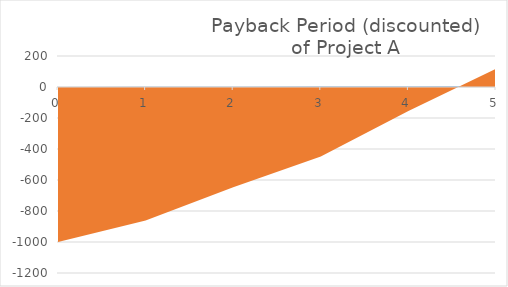
| Category | Series 0 | Series 1 |
|---|---|---|
| 0.0 | 0 | -1000 |
| 1.0 | 1 | -861.111 |
| 2.0 | 2 | -646.776 |
| 3.0 | 3 | -448.318 |
| 4.0 | 4 | -154.306 |
| 5.0 | 5 | 117.927 |